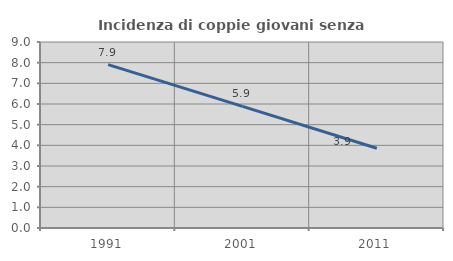
| Category | Incidenza di coppie giovani senza figli |
|---|---|
| 1991.0 | 7.906 |
| 2001.0 | 5.882 |
| 2011.0 | 3.857 |